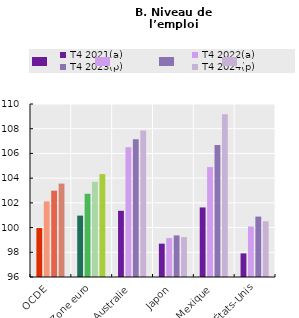
| Category | T4 2021(a) | T4 2022(a) | T4 2023(p) | T4 2024(p) |
|---|---|---|---|---|
| OCDE | 99.965 | 102.117 | 102.983 | 103.561 |
| Zone euro | 100.967 | 102.738 | 103.701 | 104.326 |
| Australie | 101.358 | 106.505 | 107.154 | 107.852 |
| Japon | 98.698 | 99.15 | 99.365 | 99.229 |
| Mexique | 101.629 | 104.896 | 106.69 | 109.165 |
| États-Unis | 97.912 | 100.087 | 100.89 | 100.512 |